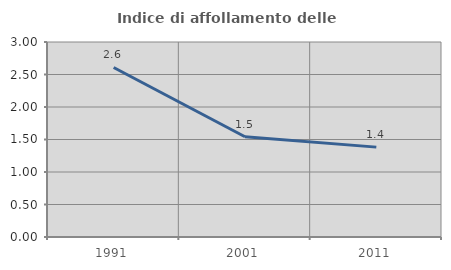
| Category | Indice di affollamento delle abitazioni  |
|---|---|
| 1991.0 | 2.608 |
| 2001.0 | 1.543 |
| 2011.0 | 1.383 |